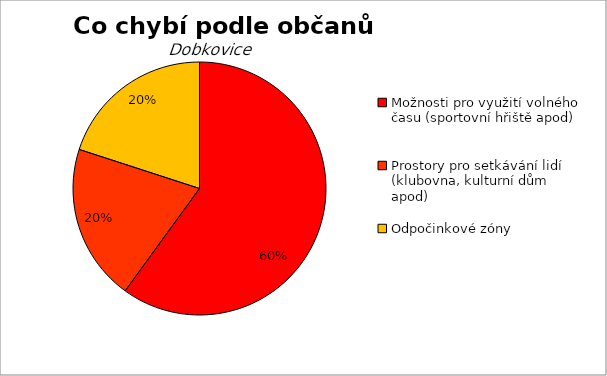
| Category | Series 0 |
|---|---|
| Možnosti pro využití volného času (sportovní hřiště apod) | 3 |
| Prostory pro setkávání lidí (klubovna, kulturní dům apod) | 1 |
| Odpočinkové zóny | 1 |